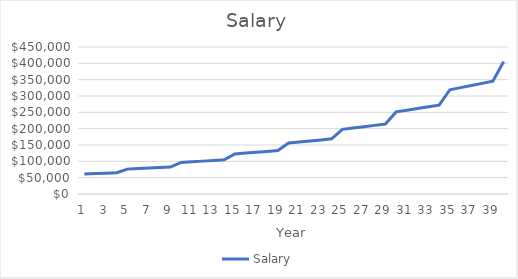
| Category | Salary |
|---|---|
| 1.0 | 61200 |
| 2.0 | 62424 |
| 3.0 | 63672.48 |
| 4.0 | 64945.93 |
| 5.0 | 76181.575 |
| 6.0 | 77705.207 |
| 7.0 | 79259.311 |
| 8.0 | 80844.497 |
| 9.0 | 82461.387 |
| 10.0 | 96727.207 |
| 11.0 | 98661.751 |
| 12.0 | 100634.986 |
| 13.0 | 102647.686 |
| 14.0 | 104700.64 |
| 15.0 | 122813.851 |
| 16.0 | 125270.128 |
| 17.0 | 127775.53 |
| 18.0 | 130331.041 |
| 19.0 | 132937.662 |
| 20.0 | 155935.877 |
| 21.0 | 159054.595 |
| 22.0 | 162235.686 |
| 23.0 | 165480.4 |
| 24.0 | 168790.008 |
| 25.0 | 197990.68 |
| 26.0 | 201950.493 |
| 27.0 | 205989.503 |
| 28.0 | 210109.293 |
| 29.0 | 214311.479 |
| 30.0 | 251387.365 |
| 31.0 | 256415.112 |
| 32.0 | 261543.414 |
| 33.0 | 266774.283 |
| 34.0 | 272109.768 |
| 35.0 | 319184.758 |
| 36.0 | 325568.453 |
| 37.0 | 332079.822 |
| 38.0 | 338721.419 |
| 39.0 | 345495.847 |
| 40.0 | 405266.629 |